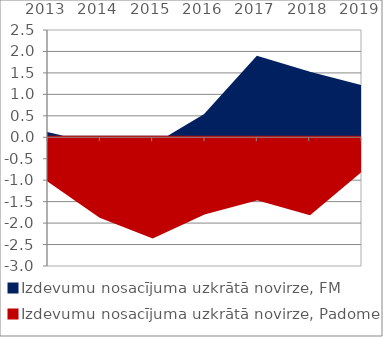
| Category | Izdevumu nosacījuma uzkrātā novirze, FM | Izdevumu nosacījuma uzkrātā novirze, Padome |
|---|---|---|
| 2013.0 | 0.081 | -0.993 |
| 2014.0 | -0.204 | -1.842 |
| 2015.0 | -0.218 | -2.322 |
| 2016.0 | 0.51 | -1.759 |
| 2017.0 | 1.86 | -1.432 |
| 2018.0 | 1.492 | -1.777 |
| 2019.0 | 1.175 | -0.757 |